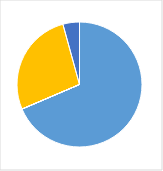
| Category | Series 0 |
|---|---|
| 0 | 0.696 |
| 1 | 0 |
| 2 | 0 |
| 3 | 0.275 |
| 4 | 0.043 |